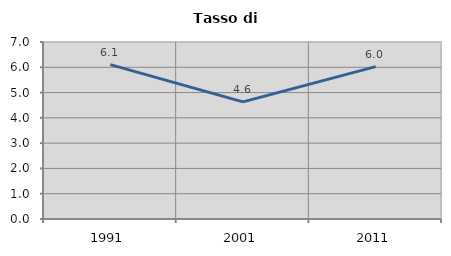
| Category | Tasso di disoccupazione   |
|---|---|
| 1991.0 | 6.104 |
| 2001.0 | 4.631 |
| 2011.0 | 6.024 |